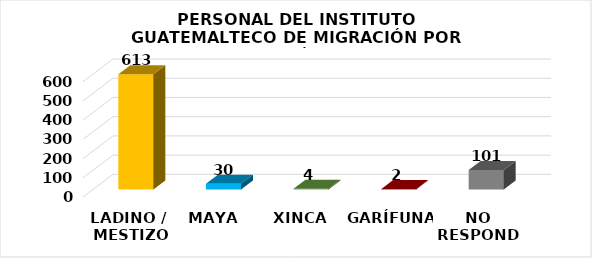
| Category | Series 0 |
|---|---|
| LADINO /
 MESTIZO | 613 |
| MAYA | 30 |
| XINCA | 4 |
| GARÍFUNA | 2 |
| NO RESPONDE | 101 |